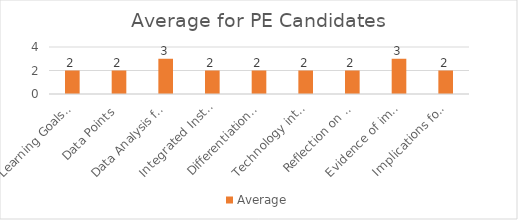
| Category | Average |
|---|---|
| Learning Goals Aligned with Pre-/Post-assessments ACEI 4.0 | 2 |
| Data Points | 2 |
| Data Analysis for Pedagogical Decisions ACEI 4.0 | 3 |
| Integrated Instruction ACEI 3.1 | 2 |
| Differentiation based on knowledge of individual learning ACEI 3.2 | 2 |
| Technology integration | 2 |
| Reflection on pedagogical decisions ACEI 1.0 | 2 |
| Evidence of impact on student learning ACEI 5.1 | 3 |
| Implications for teaching and professional development ACEI 5.1 | 2 |